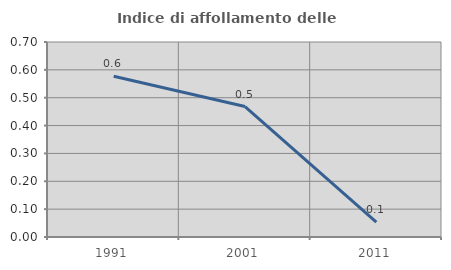
| Category | Indice di affollamento delle abitazioni  |
|---|---|
| 1991.0 | 0.577 |
| 2001.0 | 0.468 |
| 2011.0 | 0.054 |